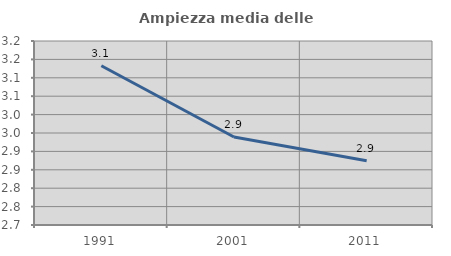
| Category | Ampiezza media delle famiglie |
|---|---|
| 1991.0 | 3.133 |
| 2001.0 | 2.939 |
| 2011.0 | 2.875 |